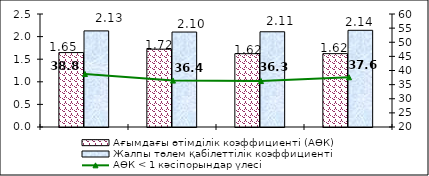
| Category | Ағымдағы өтімділік коэффициенті (AӨК) | Жалпы төлем қабілеттілік коэффициенті |
|---|---|---|
| 0 | 1.647 | 2.126 |
| 1 | 1.722 | 2.101 |
| 2 | 1.622 | 2.107 |
| 3 | 1.623 | 2.139 |